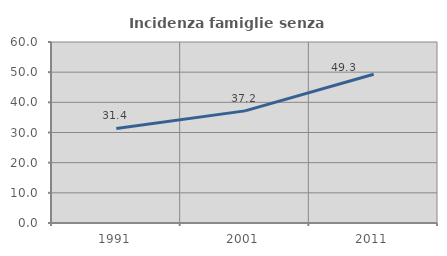
| Category | Incidenza famiglie senza nuclei |
|---|---|
| 1991.0 | 31.361 |
| 2001.0 | 37.173 |
| 2011.0 | 49.296 |